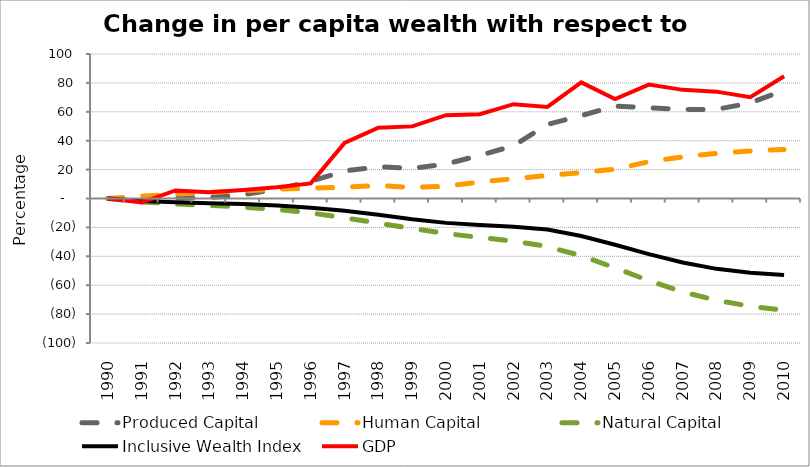
| Category | Produced Capital  | Human Capital | Natural Capital | Inclusive Wealth Index | GDP |
|---|---|---|---|---|---|
| 1990.0 | 0 | 0 | 0 | 0 | 0 |
| 1991.0 | -0.667 | 1.701 | -2.304 | -1.652 | -2.682 |
| 1992.0 | 0.373 | 2.951 | -3.778 | -2.601 | 5.605 |
| 1993.0 | 0.651 | 4.188 | -4.82 | -3.249 | 4.309 |
| 1994.0 | 2.647 | 5.329 | -5.941 | -3.875 | 5.957 |
| 1995.0 | 6.354 | 6.387 | -7.543 | -4.799 | 7.709 |
| 1996.0 | 11.842 | 7.213 | -10.009 | -6.345 | 10.462 |
| 1997.0 | 19.034 | 7.823 | -13.304 | -8.487 | 38.425 |
| 1998.0 | 21.946 | 8.921 | -17.087 | -11.202 | 48.959 |
| 1999.0 | 20.798 | 7.657 | -20.741 | -14.378 | 49.909 |
| 2000.0 | 23.823 | 8.548 | -24.212 | -16.866 | 57.677 |
| 2001.0 | 29.841 | 11.407 | -26.963 | -18.327 | 58.342 |
| 2002.0 | 36.502 | 13.678 | -29.441 | -19.614 | 65.258 |
| 2003.0 | 51.229 | 15.973 | -33.22 | -21.474 | 63.35 |
| 2004.0 | 57.336 | 17.908 | -39.61 | -25.98 | 80.361 |
| 2005.0 | 63.988 | 20.266 | -47.987 | -31.991 | 68.881 |
| 2006.0 | 62.803 | 25.47 | -56.862 | -38.461 | 78.807 |
| 2007.0 | 61.643 | 28.827 | -64.601 | -44.274 | 75.18 |
| 2008.0 | 61.691 | 31.251 | -70.511 | -48.679 | 73.955 |
| 2009.0 | 66.064 | 32.894 | -74.576 | -51.46 | 70.169 |
| 2010.0 | 75.034 | 33.928 | -77.27 | -52.959 | 84.562 |